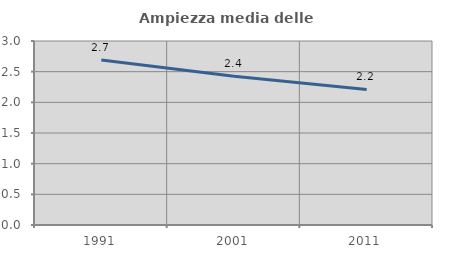
| Category | Ampiezza media delle famiglie |
|---|---|
| 1991.0 | 2.69 |
| 2001.0 | 2.425 |
| 2011.0 | 2.21 |